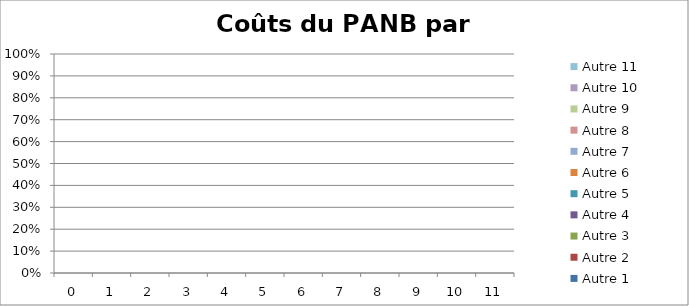
| Category | Autre 1 | Autre 2 | Autre 3 | Autre 4 | Autre 5 | Autre 6 | Autre 7 | Autre 8 | Autre 9 | Autre 10 | Autre 11 |
|---|---|---|---|---|---|---|---|---|---|---|---|
| 0.0 | 0 | 0 | 0 | 0 | 0 | 0 | 0 | 0 | 0 | 0 | 0 |
| 1.0 | 0 | 0 | 0 | 0 | 0 | 0 | 0 | 0 | 0 | 0 | 0 |
| 2.0 | 0 | 0 | 0 | 0 | 0 | 0 | 0 | 0 | 0 | 0 | 0 |
| 3.0 | 0 | 0 | 0 | 0 | 0 | 0 | 0 | 0 | 0 | 0 | 0 |
| 4.0 | 0 | 0 | 0 | 0 | 0 | 0 | 0 | 0 | 0 | 0 | 0 |
| 5.0 | 0 | 0 | 0 | 0 | 0 | 0 | 0 | 0 | 0 | 0 | 0 |
| 6.0 | 0 | 0 | 0 | 0 | 0 | 0 | 0 | 0 | 0 | 0 | 0 |
| 7.0 | 0 | 0 | 0 | 0 | 0 | 0 | 0 | 0 | 0 | 0 | 0 |
| 8.0 | 0 | 0 | 0 | 0 | 0 | 0 | 0 | 0 | 0 | 0 | 0 |
| 9.0 | 0 | 0 | 0 | 0 | 0 | 0 | 0 | 0 | 0 | 0 | 0 |
| 10.0 | 0 | 0 | 0 | 0 | 0 | 0 | 0 | 0 | 0 | 0 | 0 |
| 11.0 | 0 | 0 | 0 | 0 | 0 | 0 | 0 | 0 | 0 | 0 | 0 |